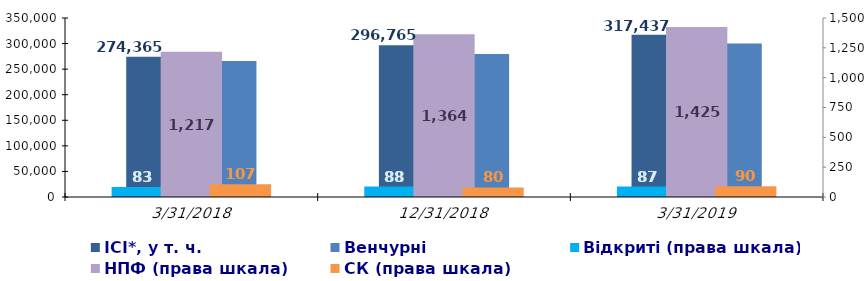
| Category | ІСІ*, у т. ч. | Венчурні |
|---|---|---|
| 3/31/18 | 274364.654 | 265684.134 |
| 12/31/18 | 296765.381 | 279713.253 |
| 3/31/19 | 317437.485 | 300241.731 |